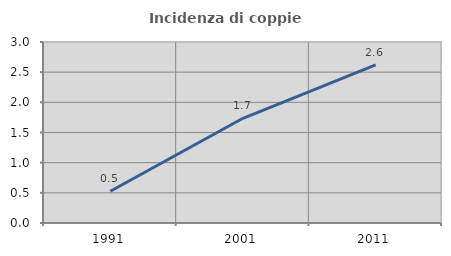
| Category | Incidenza di coppie miste |
|---|---|
| 1991.0 | 0.526 |
| 2001.0 | 1.736 |
| 2011.0 | 2.622 |